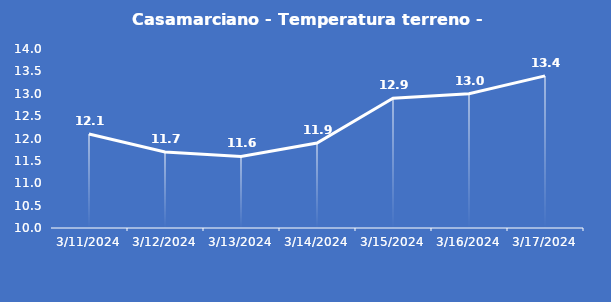
| Category | Casamarciano - Temperatura terreno - Grezzo (°C) |
|---|---|
| 3/11/24 | 12.1 |
| 3/12/24 | 11.7 |
| 3/13/24 | 11.6 |
| 3/14/24 | 11.9 |
| 3/15/24 | 12.9 |
| 3/16/24 | 13 |
| 3/17/24 | 13.4 |